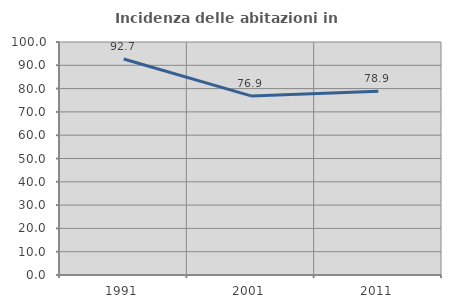
| Category | Incidenza delle abitazioni in proprietà  |
|---|---|
| 1991.0 | 92.683 |
| 2001.0 | 76.866 |
| 2011.0 | 78.912 |